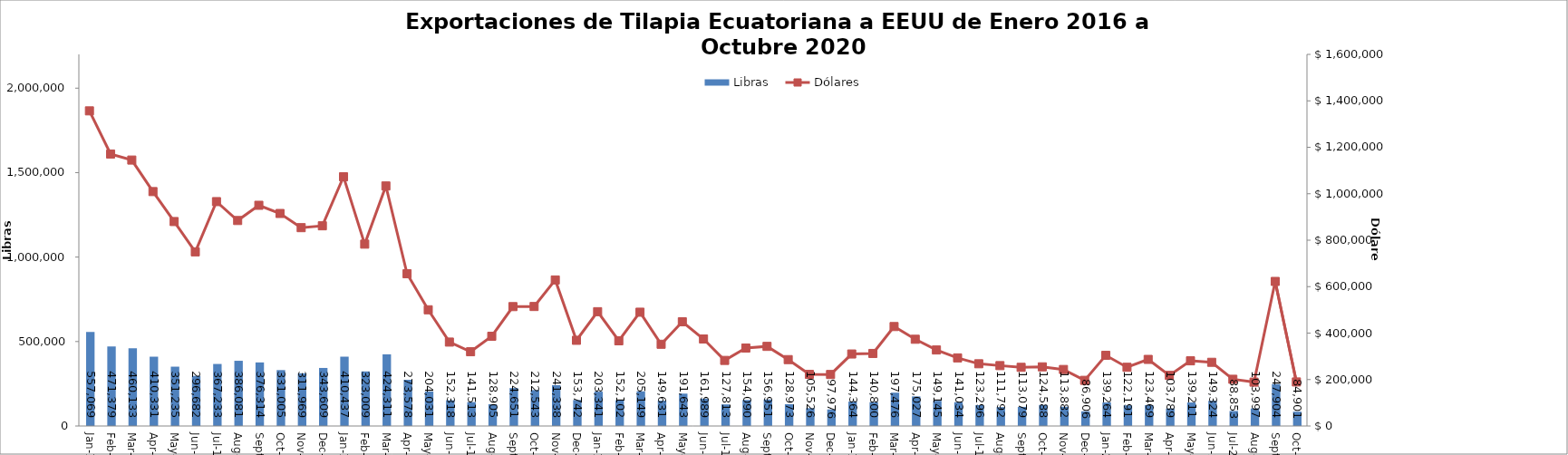
| Category | Libras  |
|---|---|
| 2016-01-01 | 557069.351 |
| 2016-02-01 | 471378.754 |
| 2016-03-01 | 460133.089 |
| 2016-04-01 | 410331.175 |
| 2016-05-01 | 351235 |
| 2016-06-01 | 296682 |
| 2016-07-01 | 367233.45 |
| 2016-08-01 | 386080.575 |
| 2016-09-01 | 376314.197 |
| 2016-10-01 | 331005.258 |
| 2016-11-01 | 311968.537 |
| 2016-12-01 | 343608.956 |
| 2017-01-01 | 410436.996 |
| 2017-02-01 | 323009.174 |
| 2017-03-01 | 424310.544 |
| 2017-04-01 | 273577.632 |
| 2017-05-01 | 204031.321 |
| 2017-06-01 | 152318.019 |
| 2017-07-01 | 141513.274 |
| 2017-08-01 | 128905.167 |
| 2017-09-01 | 224650.945 |
| 2017-10-01 | 212543.281 |
| 2017-11-01 | 241337.562 |
| 2017-12-01 | 153742.19 |
| 2018-01-01 | 203341.281 |
| 2018-02-01 | 152101.968 |
| 2018-03-01 | 205149.053 |
| 2018-04-01 | 149630.611 |
| 2018-05-01 | 191643 |
| 2018-06-01 | 161989 |
| 2018-07-01 | 127813 |
| 2018-08-01 | 154089.894 |
| 2018-09-01 | 156951.494 |
| 2018-10-01 | 128972.628 |
| 2018-11-01 | 105526.466 |
| 2018-12-01 | 97975.634 |
| 2019-01-01 | 144364.157 |
| 2019-02-01 | 140800 |
| 2019-03-01 | 197476 |
| 2019-04-01 | 175027.19 |
| 2019-05-01 | 149144.92 |
| 2019-06-01 | 141034.12 |
| 2019-07-01 | 123295.72 |
| 2019-08-01 | 111792 |
| 2019-09-01 | 113079.347 |
| 2019-10-01 | 124588.429 |
| 2019-11-01 | 113882.151 |
| 2019-12-01 | 86905.72 |
| 2020-01-01 | 139264.124 |
| 2020-02-01 | 122191.168 |
| 2020-03-01 | 123468.964 |
| 2020-04-01 | 103789.125 |
| 2020-05-01 | 139210.604 |
| 2020-06-01 | 149323.7 |
| 2020-07-01 | 88852.518 |
| 2020-08-01 | 103996.516 |
| 2020-09-01 | 247903.522 |
| 2020-10-01 | 84900.941 |